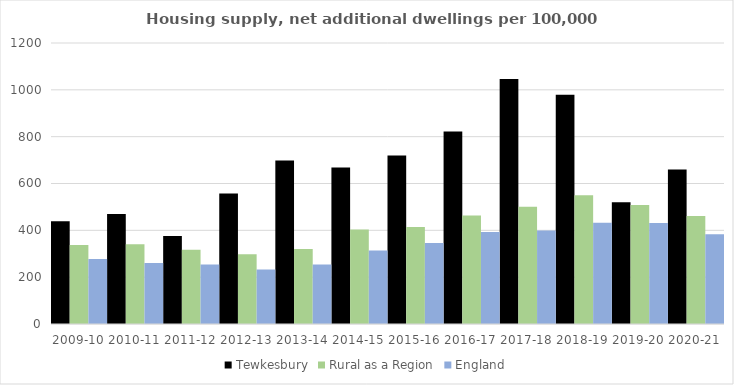
| Category | Tewkesbury | Rural as a Region | England |
|---|---|---|---|
| 2009-10 | 438.655 | 337.852 | 277.548 |
| 2010-11 | 470.166 | 340.105 | 260.994 |
| 2011-12 | 375.597 | 317.04 | 254.007 |
| 2012-13 | 557.791 | 297.763 | 233.153 |
| 2013-14 | 698.505 | 319.835 | 253.602 |
| 2014-15 | 667.848 | 403.796 | 314.256 |
| 2015-16 | 719.482 | 414.091 | 346.154 |
| 2016-17 | 822.432 | 463.209 | 393.256 |
| 2017-18 | 1046.141 | 500.68 | 399.646 |
| 2018-19 | 979.492 | 549.491 | 432.099 |
| 2019-20 | 519.896 | 508.493 | 431.187 |
| 2020-21 | 659.256 | 461.114 | 382.827 |